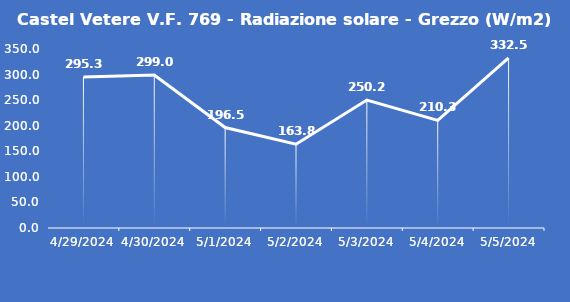
| Category | Castel Vetere V.F. 769 - Radiazione solare - Grezzo (W/m2) |
|---|---|
| 4/29/24 | 295.3 |
| 4/30/24 | 299 |
| 5/1/24 | 196.5 |
| 5/2/24 | 163.8 |
| 5/3/24 | 250.2 |
| 5/4/24 | 210.3 |
| 5/5/24 | 332.5 |